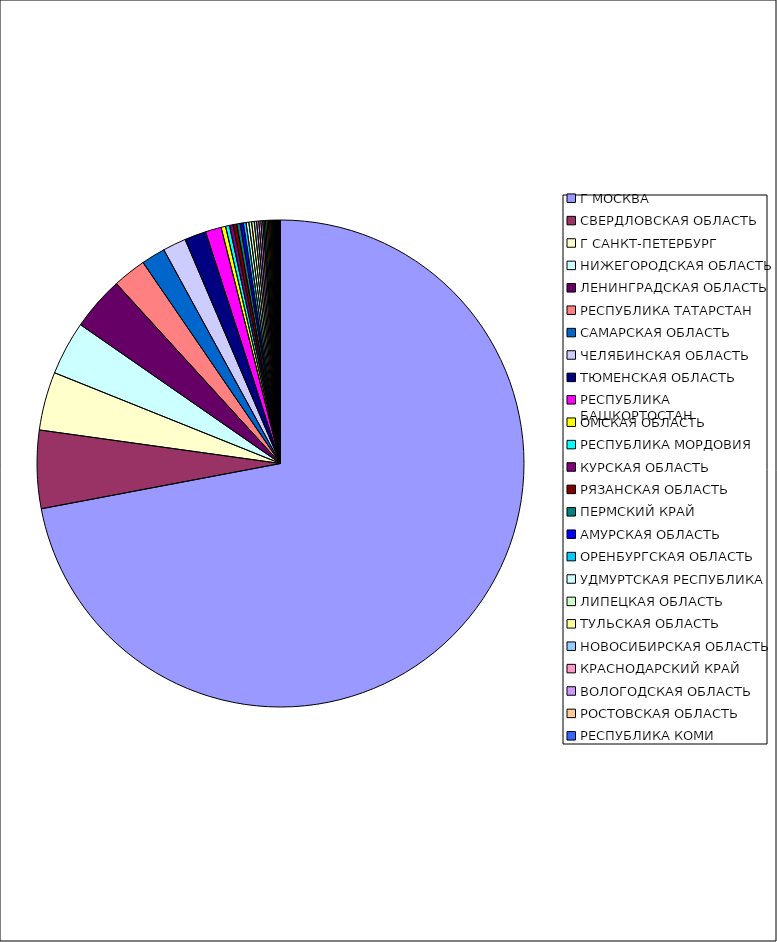
| Category | Оборот |
|---|---|
| Г МОСКВА | 0.719 |
| СВЕРДЛОВСКАЯ ОБЛАСТЬ | 0.052 |
| Г САНКТ-ПЕТЕРБУРГ | 0.039 |
| НИЖЕГОРОДСКАЯ ОБЛАСТЬ | 0.036 |
| ЛЕНИНГРАДСКАЯ ОБЛАСТЬ | 0.036 |
| РЕСПУБЛИКА ТАТАРСТАН | 0.022 |
| САМАРСКАЯ ОБЛАСТЬ | 0.016 |
| ЧЕЛЯБИНСКАЯ ОБЛАСТЬ | 0.015 |
| ТЮМЕНСКАЯ ОБЛАСТЬ | 0.014 |
| РЕСПУБЛИКА БАШКОРТОСТАН | 0.011 |
| ОМСКАЯ ОБЛАСТЬ | 0.003 |
| РЕСПУБЛИКА МОРДОВИЯ | 0.003 |
| КУРСКАЯ ОБЛАСТЬ | 0.002 |
| РЯЗАНСКАЯ ОБЛАСТЬ | 0.002 |
| ПЕРМСКИЙ КРАЙ | 0.002 |
| АМУРСКАЯ ОБЛАСТЬ | 0.002 |
| ОРЕНБУРГСКАЯ ОБЛАСТЬ | 0.002 |
| УДМУРТСКАЯ РЕСПУБЛИКА | 0.002 |
| ЛИПЕЦКАЯ ОБЛАСТЬ | 0.002 |
| ТУЛЬСКАЯ ОБЛАСТЬ | 0.002 |
| НОВОСИБИРСКАЯ ОБЛАСТЬ | 0.002 |
| КРАСНОДАРСКИЙ КРАЙ | 0.001 |
| ВОЛОГОДСКАЯ ОБЛАСТЬ | 0.001 |
| РОСТОВСКАЯ ОБЛАСТЬ | 0.001 |
| РЕСПУБЛИКА КОМИ | 0.001 |
| КАЛУЖСКАЯ ОБЛАСТЬ | 0.001 |
| САРАТОВСКАЯ ОБЛАСТЬ | 0.001 |
| УЛЬЯНОВСКАЯ ОБЛАСТЬ | 0.001 |
| РЕСПУБЛИКА ДАГЕСТАН | 0.001 |
| СМОЛЕНСКАЯ ОБЛАСТЬ | 0.001 |
| ИВАНОВСКАЯ ОБЛАСТЬ | 0.001 |
| КАБАРДИНО-БАЛКАРСКАЯ РЕСПУБЛИКА | 0.001 |
| ПСКОВСКАЯ ОБЛАСТЬ | 0.001 |
| ЧУВАШСКАЯ РЕСПУБЛИКА | 0.001 |
| ОРЛОВСКАЯ ОБЛАСТЬ | 0 |
| ИРКУТСКАЯ ОБЛАСТЬ | 0 |
| КИРОВСКАЯ ОБЛАСТЬ | 0 |
| КРАСНОЯРСКИЙ КРАЙ | 0 |
| РЕСПУБЛИКА СЕВЕРНАЯ ОСЕТИЯ-АЛАНИЯ | 0 |
| КОСТРОМСКАЯ ОБЛАСТЬ | 0 |
| АЛТАЙСКИЙ КРАЙ | 0 |
| ХАБАРОВСКИЙ КРАЙ | 0 |
| СТАВРОПОЛЬСКИЙ КРАЙ | 0 |
| САХАЛИНСКАЯ ОБЛАСТЬ | 0 |
| МОСКОВСКАЯ ОБЛАСТЬ | 0 |
| РЕСПУБЛИКА САХА(ЯКУТИЯ) | 0 |